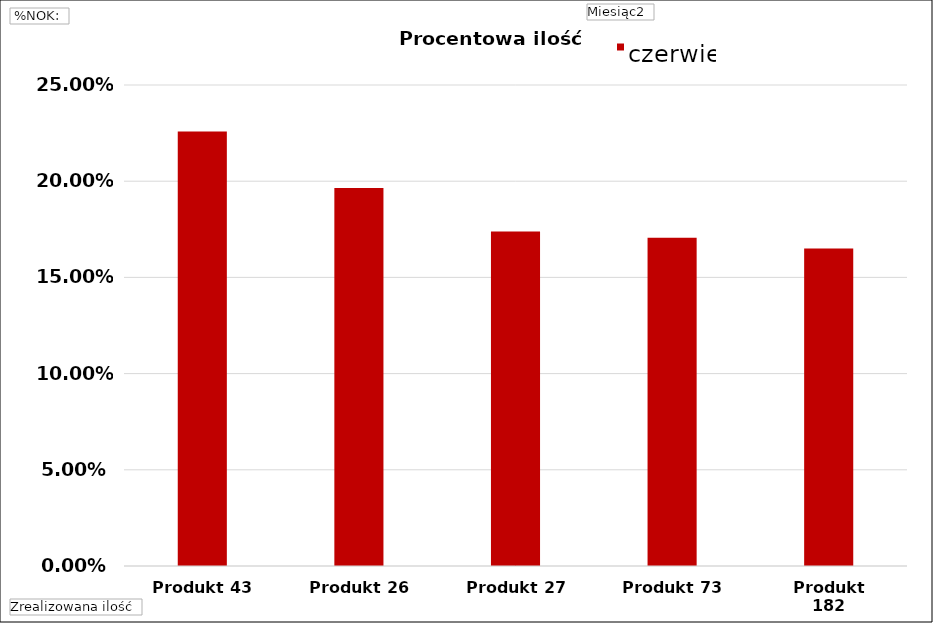
| Category | czerwiec |
|---|---|
| Produkt 43 | 0.226 |
| Produkt 26 | 0.196 |
| Produkt 27 | 0.174 |
| Produkt 73 | 0.171 |
| Produkt 182 | 0.165 |